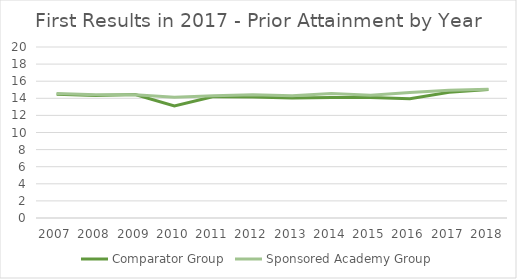
| Category | Comparator Group | Sponsored Academy Group |
|---|---|---|
| 2007.0 | 14.481 | 14.566 |
| 2008.0 | 14.326 | 14.409 |
| 2009.0 | 14.431 | 14.404 |
| 2010.0 | 13.094 | 14.135 |
| 2011.0 | 14.196 | 14.301 |
| 2012.0 | 14.138 | 14.415 |
| 2013.0 | 14.047 | 14.296 |
| 2014.0 | 14.088 | 14.553 |
| 2015.0 | 14.103 | 14.349 |
| 2016.0 | 13.944 | 14.692 |
| 2017.0 | 14.703 | 14.953 |
| 2018.0 | 15.026 | 15.066 |